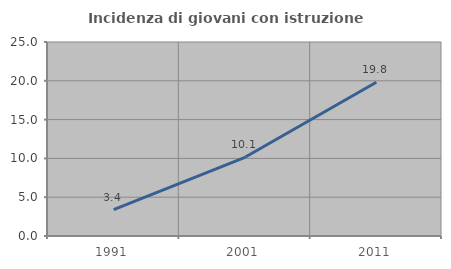
| Category | Incidenza di giovani con istruzione universitaria |
|---|---|
| 1991.0 | 3.409 |
| 2001.0 | 10.145 |
| 2011.0 | 19.82 |